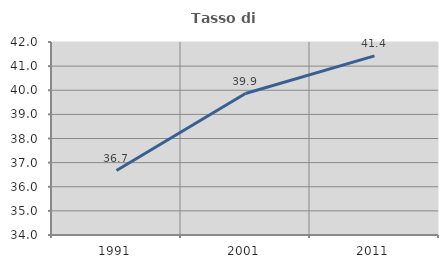
| Category | Tasso di occupazione   |
|---|---|
| 1991.0 | 36.671 |
| 2001.0 | 39.865 |
| 2011.0 | 41.426 |